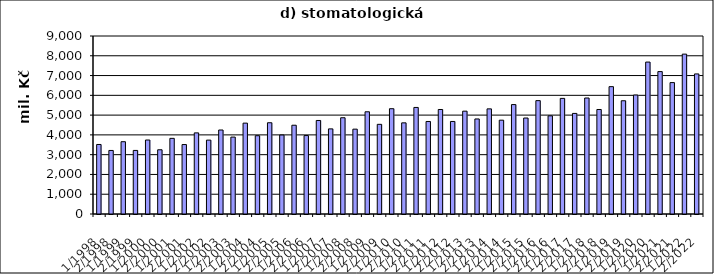
| Category | Series 0 |
|---|---|
| 1/1998 | 3515432.421 |
| 2/1998 | 3212433.829 |
| 1/1999 | 3655162.521 |
| 2/1999 | 3214272.479 |
| 1/2000 | 3741126.891 |
| 2/2000 | 3247495.509 |
| 1/2001 | 3824635.222 |
| 2/2001 | 3511526.704 |
| 1/2002 | 4101374 |
| 2/2002 | 3735503 |
| 1/2003 | 4246929 |
| 2/2003 | 3889102.248 |
| 1/2004 | 4594398.653 |
| 2/2004 | 3958067.471 |
| 1/2005 | 4614097 |
| 2/2005 | 3993003.251 |
| 1/2006 | 4488901 |
| 2/2006 | 3965590 |
| 1/2007 | 4728410 |
| 2/2007 | 4303714 |
| 1/2008 | 4867338.45 |
| 2/2008 | 4289919.55 |
| 1/2009 | 5168332 |
| 2/2009 | 4533427 |
| 1/2010 | 5323775 |
| 2/2010 | 4608300 |
| 1/2011 | 5387942 |
| 2/2011 | 4677891 |
| 1/2012 | 5284305 |
| 2/2012 | 4679314 |
| 1/2013 | 5199899 |
| 2/2013 | 4805072 |
| 1/2014 | 5315320 |
| 2/2014 | 4743466 |
| 1/2015 | 5532126 |
| 2/2015 | 4853018 |
| 1/2016 | 5732094 |
| 2/2016 | 4963624 |
| 1/2017 | 5846000 |
| 2/2017 | 5085949 |
| 1/2018 | 5864440.949 |
| 2/2018 | 5284342.393 |
| 1/2019 | 6439364.35 |
| 2/2019 | 5725485.425 |
| 1/2020 | 6016111.01 |
| 2/2020 | 7682066.99 |
| 1/2021 | 7200263.115 |
| 2/2021 | 6643599.674 |
| 1/2022 | 8082903.28 |
| 2/2022 | 7082423.671 |